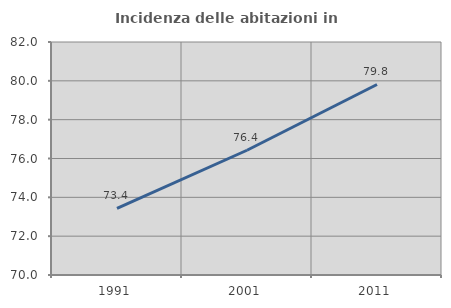
| Category | Incidenza delle abitazioni in proprietà  |
|---|---|
| 1991.0 | 73.429 |
| 2001.0 | 76.425 |
| 2011.0 | 79.812 |